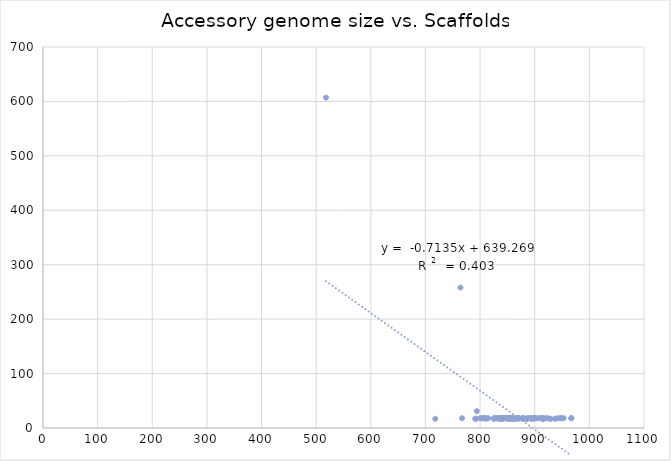
| Category | Series 1 |
|---|---|
| 794.0 | 31 |
| 791.0 | 17 |
| 851.0 | 17 |
| 915.0 | 16 |
| 864.0 | 17 |
| 767.0 | 18 |
| 849.0 | 18 |
| 920.0 | 18 |
| 841.0 | 18 |
| 894.0 | 18 |
| 826.0 | 18 |
| 852.0 | 18 |
| 953.0 | 18 |
| 800.0 | 18 |
| 871.0 | 18 |
| 859.0 | 17 |
| 839.0 | 18 |
| 857.0 | 17 |
| 886.0 | 17 |
| 849.0 | 18 |
| 903.0 | 18 |
| 859.0 | 18 |
| 838.0 | 18 |
| 826.0 | 18 |
| 889.0 | 18 |
| 827.0 | 18 |
| 844.0 | 18 |
| 898.0 | 17 |
| 909.0 | 18 |
| 848.0 | 18 |
| 854.0 | 18 |
| 870.0 | 18 |
| 928.0 | 17 |
| 878.0 | 18 |
| 879.0 | 17 |
| 857.0 | 17 |
| 825.0 | 17 |
| 838.0 | 17 |
| 858.0 | 18 |
| 810.0 | 18 |
| 880.0 | 17 |
| 887.0 | 18 |
| 856.0 | 18 |
| 861.0 | 17 |
| 967.0 | 18 |
| 854.0 | 18 |
| 886.0 | 17 |
| 894.0 | 17 |
| 793.0 | 17 |
| 855.0 | 17 |
| 718.0 | 17 |
| 913.0 | 18 |
| 863.0 | 17 |
| 942.0 | 18 |
| 806.0 | 18 |
| 880.0 | 18 |
| 858.0 | 18 |
| 852.0 | 18 |
| 893.0 | 18 |
| 929.0 | 17 |
| 840.0 | 17 |
| 832.0 | 18 |
| 841.0 | 17 |
| 878.0 | 18 |
| 832.0 | 18 |
| 914.0 | 18 |
| 885.0 | 17 |
| 900.0 | 18 |
| 811.0 | 18 |
| 811.0 | 17 |
| 967.0 | 18 |
| 949.0 | 18 |
| 843.0 | 18 |
| 842.0 | 18 |
| 838.0 | 18 |
| 837.0 | 18 |
| 865.0 | 18 |
| 867.0 | 18 |
| 834.0 | 17 |
| 903.0 | 18 |
| 915.0 | 18 |
| 947.0 | 18 |
| 871.0 | 18 |
| 804.0 | 18 |
| 857.0 | 18 |
| 870.0 | 17 |
| 826.0 | 17 |
| 937.0 | 17 |
| 764.0 | 258 |
| 807.0 | 18 |
| 894.0 | 18 |
| 815.0 | 18 |
| 849.0 | 18 |
| 898.0 | 18 |
| 923.0 | 18 |
| 899.0 | 18 |
| 840.0 | 18 |
| 849.0 | 18 |
| 865.0 | 18 |
| 518.0 | 607 |